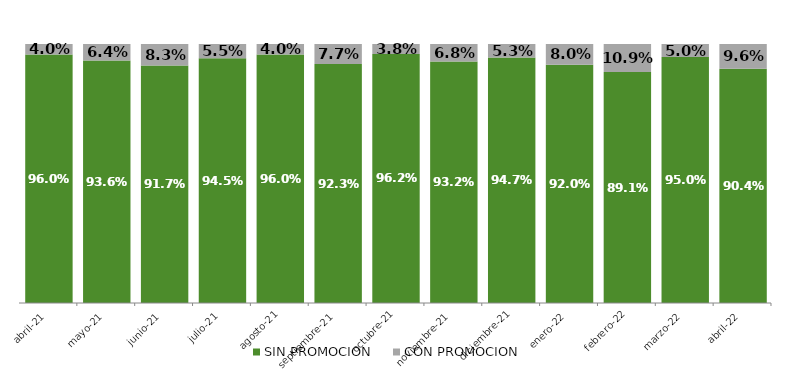
| Category | SIN PROMOCION   | CON PROMOCION   |
|---|---|---|
| 2021-04-01 | 0.96 | 0.04 |
| 2021-05-01 | 0.936 | 0.064 |
| 2021-06-01 | 0.917 | 0.083 |
| 2021-07-01 | 0.945 | 0.055 |
| 2021-08-01 | 0.96 | 0.04 |
| 2021-09-01 | 0.923 | 0.077 |
| 2021-10-01 | 0.962 | 0.038 |
| 2021-11-01 | 0.932 | 0.068 |
| 2021-12-01 | 0.947 | 0.053 |
| 2022-01-01 | 0.92 | 0.08 |
| 2022-02-01 | 0.891 | 0.109 |
| 2022-03-01 | 0.95 | 0.05 |
| 2022-04-01 | 0.904 | 0.096 |